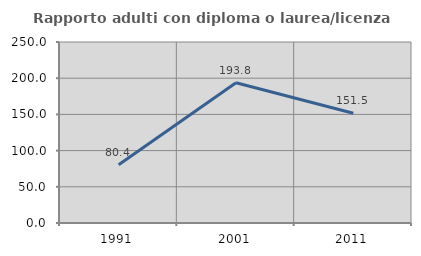
| Category | Rapporto adulti con diploma o laurea/licenza media  |
|---|---|
| 1991.0 | 80.357 |
| 2001.0 | 193.75 |
| 2011.0 | 151.515 |